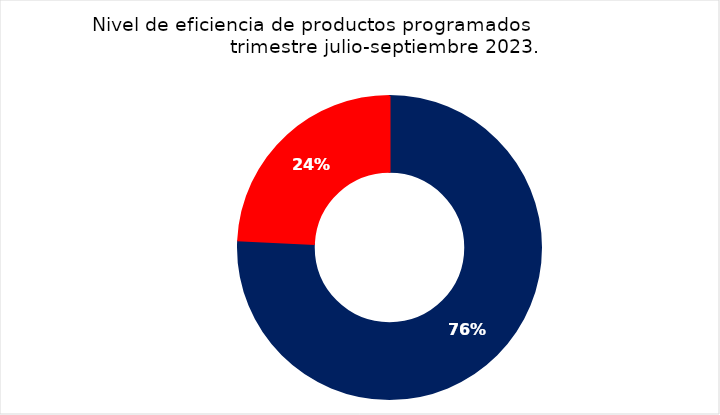
| Category | Series 0 |
|---|---|
| 70-100 | 25 |
| Otras | 8 |